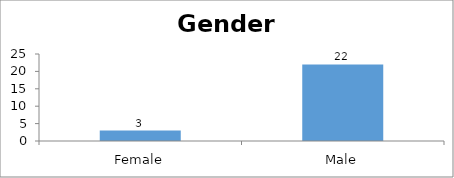
| Category | Gender |
|---|---|
| Female | 3 |
| Male | 22 |